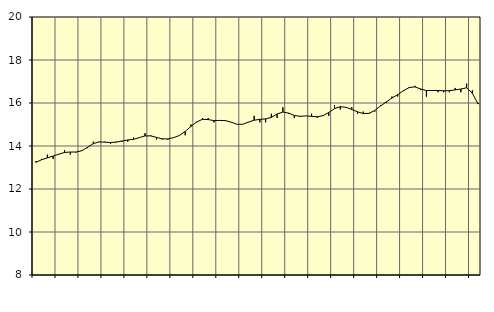
| Category | Piggar | Vård och omsorg, SNI 86-88 |
|---|---|---|
| nan | 13.3 | 13.24 |
| 1.0 | 13.4 | 13.36 |
| 1.0 | 13.6 | 13.45 |
| 1.0 | 13.4 | 13.53 |
| nan | 13.6 | 13.62 |
| 2.0 | 13.8 | 13.7 |
| 2.0 | 13.6 | 13.72 |
| 2.0 | 13.7 | 13.72 |
| nan | 13.8 | 13.78 |
| 3.0 | 13.9 | 13.94 |
| 3.0 | 14.2 | 14.11 |
| 3.0 | 14.2 | 14.19 |
| nan | 14.2 | 14.18 |
| 4.0 | 14.1 | 14.16 |
| 4.0 | 14.2 | 14.18 |
| 4.0 | 14.2 | 14.23 |
| nan | 14.2 | 14.28 |
| 5.0 | 14.4 | 14.31 |
| 5.0 | 14.4 | 14.39 |
| 5.0 | 14.6 | 14.47 |
| nan | 14.5 | 14.47 |
| 6.0 | 14.3 | 14.4 |
| 6.0 | 14.3 | 14.33 |
| 6.0 | 14.3 | 14.33 |
| nan | 14.4 | 14.39 |
| 7.0 | 14.5 | 14.49 |
| 7.0 | 14.5 | 14.68 |
| 7.0 | 15 | 14.91 |
| nan | 15.1 | 15.12 |
| 8.0 | 15.3 | 15.24 |
| 8.0 | 15.3 | 15.23 |
| 8.0 | 15.1 | 15.18 |
| nan | 15.2 | 15.19 |
| 9.0 | 15.2 | 15.18 |
| 9.0 | 15.1 | 15.11 |
| 9.0 | 15 | 15.01 |
| nan | 15 | 15.01 |
| 10.0 | 15.1 | 15.11 |
| 10.0 | 15.4 | 15.2 |
| 10.0 | 15.1 | 15.24 |
| nan | 15.1 | 15.26 |
| 11.0 | 15.5 | 15.33 |
| 11.0 | 15.3 | 15.49 |
| 11.0 | 15.8 | 15.58 |
| nan | 15.5 | 15.53 |
| 12.0 | 15.3 | 15.42 |
| 12.0 | 15.4 | 15.38 |
| 12.0 | 15.4 | 15.4 |
| nan | 15.5 | 15.38 |
| 13.0 | 15.3 | 15.36 |
| 13.0 | 15.4 | 15.41 |
| 13.0 | 15.4 | 15.56 |
| nan | 15.9 | 15.74 |
| 14.0 | 15.7 | 15.83 |
| 14.0 | 15.8 | 15.8 |
| 14.0 | 15.8 | 15.7 |
| nan | 15.5 | 15.59 |
| 15.0 | 15.6 | 15.51 |
| 15.0 | 15.5 | 15.52 |
| 15.0 | 15.6 | 15.65 |
| nan | 15.9 | 15.86 |
| 16.0 | 16 | 16.05 |
| 16.0 | 16.3 | 16.23 |
| 16.0 | 16.3 | 16.39 |
| nan | 16.6 | 16.57 |
| 17.0 | 16.7 | 16.72 |
| 17.0 | 16.8 | 16.75 |
| 17.0 | 16.6 | 16.65 |
| nan | 16.3 | 16.58 |
| 18.0 | 16.6 | 16.58 |
| 18.0 | 16.5 | 16.58 |
| 18.0 | 16.5 | 16.57 |
| nan | 16.5 | 16.57 |
| 19.0 | 16.7 | 16.61 |
| 19.0 | 16.5 | 16.65 |
| 19.0 | 16.9 | 16.71 |
| nan | 16.6 | 16.45 |
| 20.0 | 16 | 15.95 |